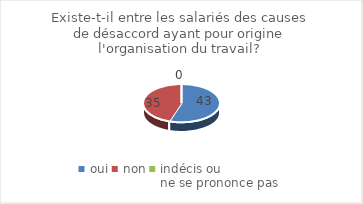
| Category | Existe-t-il entre les salariés des causes de désaccord ayant pour origine l'organisation du travail? |
|---|---|
| oui | 43 |
| non | 35 |
| indécis ou 
ne se prononce pas | 0 |